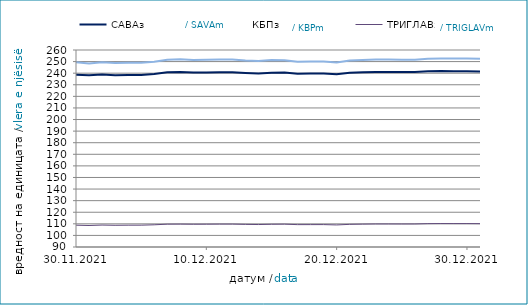
| Category | САВАз | КБПз | ТРИГЛАВз |
|---|---|---|---|
| 2021-11-30 | 238.726 | 249.364 | 108.819 |
| 2021-12-01 | 238.146 | 248.264 | 108.549 |
| 2021-12-02 | 238.854 | 249.516 | 108.923 |
| 2021-12-03 | 238.248 | 248.779 | 108.726 |
| 2021-12-04 | 238.486 | 249.086 | 108.82 |
| 2021-12-05 | 238.498 | 249.099 | 108.825 |
| 2021-12-06 | 239.233 | 249.902 | 109.15 |
| 2021-12-07 | 240.78 | 251.577 | 109.69 |
| 2021-12-08 | 241.009 | 251.927 | 109.752 |
| 2021-12-09 | 240.521 | 251.383 | 109.64 |
| 2021-12-10 | 240.512 | 251.495 | 109.681 |
| 2021-12-11 | 240.709 | 251.748 | 109.759 |
| 2021-12-12 | 240.721 | 251.761 | 109.763 |
| 2021-12-13 | 240.24 | 250.865 | 109.519 |
| 2021-12-14 | 239.693 | 250.452 | 109.378 |
| 2021-12-15 | 240.393 | 251.265 | 109.616 |
| 2021-12-16 | 240.491 | 251.233 | 109.704 |
| 2021-12-17 | 239.584 | 249.92 | 109.303 |
| 2021-12-18 | 239.635 | 249.971 | 109.32 |
| 2021-12-19 | 239.648 | 249.984 | 109.324 |
| 2021-12-20 | 239.121 | 249.303 | 109.034 |
| 2021-12-21 | 240.325 | 250.838 | 109.538 |
| 2021-12-22 | 240.755 | 251.4 | 109.729 |
| 2021-12-23 | 241.094 | 251.725 | 109.878 |
| 2021-12-24 | 241.085 | 251.716 | 109.875 |
| 2021-12-25 | 241.042 | 251.66 | 109.861 |
| 2021-12-26 | 241.054 | 251.673 | 109.865 |
| 2021-12-27 | 241.671 | 252.551 | 110.146 |
| 2021-12-28 | 241.856 | 252.734 | 110.232 |
| 2021-12-29 | 241.668 | 252.648 | 110.198 |
| 2021-12-30 | 241.764 | 252.643 | 110.211 |
| 2021-12-31 | 241.504 | 252.374 | 110.129 |